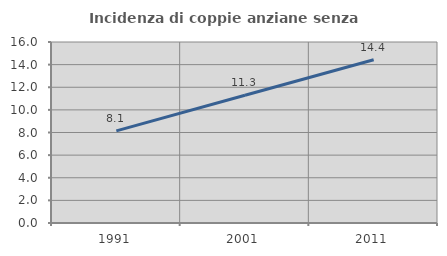
| Category | Incidenza di coppie anziane senza figli  |
|---|---|
| 1991.0 | 8.146 |
| 2001.0 | 11.292 |
| 2011.0 | 14.435 |